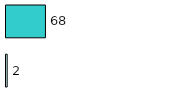
| Category | Series 0 | Series 1 |
|---|---|---|
| 0 | 2 | 68 |